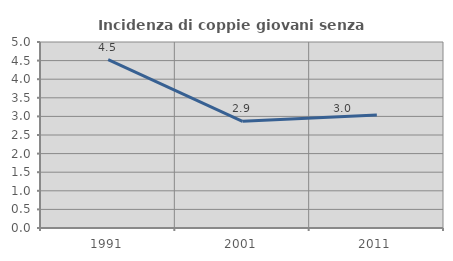
| Category | Incidenza di coppie giovani senza figli |
|---|---|
| 1991.0 | 4.525 |
| 2001.0 | 2.869 |
| 2011.0 | 3.036 |